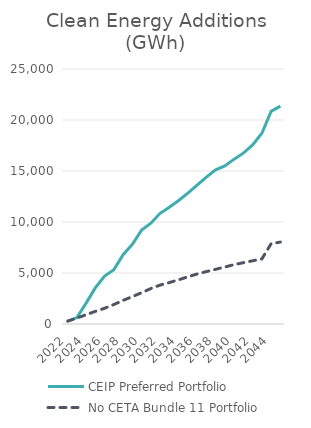
| Category | CEIP Preferred Portfolio | No CETA Bundle 11 Portfolio |
|---|---|---|
| 2022.0 | 289.168 | 275.559 |
| 2023.0 | 629.51 | 577.865 |
| 2024.0 | 2047.846 | 910.409 |
| 2025.0 | 3558.007 | 1239.186 |
| 2026.0 | 4693.415 | 1547.161 |
| 2027.0 | 5327.519 | 1911.874 |
| 2028.0 | 6787.995 | 2319.962 |
| 2029.0 | 7816.488 | 2685.809 |
| 2030.0 | 9204.227 | 3069.894 |
| 2031.0 | 9879.826 | 3475.143 |
| 2032.0 | 10851.425 | 3818.469 |
| 2033.0 | 11447.848 | 4063.082 |
| 2034.0 | 12105.855 | 4335.278 |
| 2035.0 | 12833.71 | 4626.692 |
| 2036.0 | 13626.908 | 4901.35 |
| 2037.0 | 14398.718 | 5137.045 |
| 2038.0 | 15110.767 | 5360.286 |
| 2039.0 | 15499.762 | 5587.897 |
| 2040.0 | 16162.85 | 5822.328 |
| 2041.0 | 16750.839 | 6010.785 |
| 2042.0 | 17563.592 | 6199.636 |
| 2043.0 | 18694.888 | 6380.74 |
| 2044.0 | 20848.235 | 7872.749 |
| 2045.0 | 21354.889 | 8031.373 |